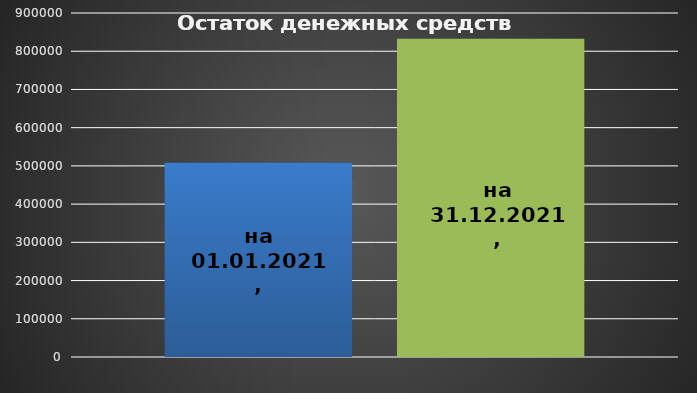
| Category | на 01.01.2021 | на 31.12.2021 |
|---|---|---|
| 0 | 508624.06 | 832940.85 |